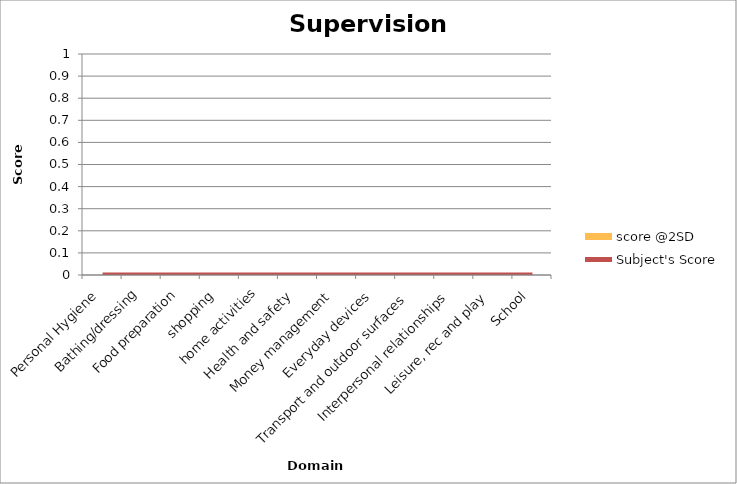
| Category | score @2SD |
|---|---|
| Personal Hygiene | 0 |
| Bathing/dressing | 0 |
| Food preparation | 0 |
| shopping | 0 |
| home activities | 0 |
| Health and safety | 0 |
| Money management | 0 |
| Everyday devices | 0 |
| Transport and outdoor surfaces | 0 |
| Interpersonal relationships | 0 |
| Leisure, rec and play | 0 |
| School | 0 |